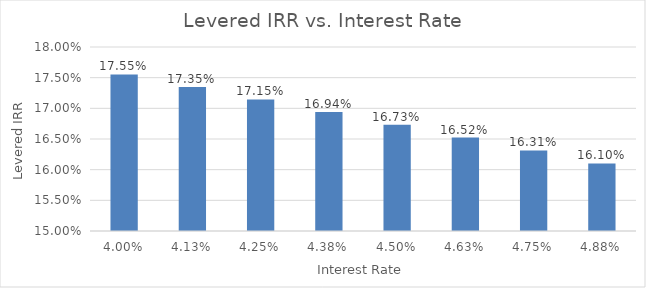
| Category | 15.54% |
|---|---|
| 0.04 | 0.176 |
| 0.04125 | 0.173 |
| 0.0425 | 0.171 |
| 0.043750000000000004 | 0.169 |
| 0.045000000000000005 | 0.167 |
| 0.046250000000000006 | 0.165 |
| 0.04750000000000001 | 0.163 |
| 0.04875000000000001 | 0.161 |